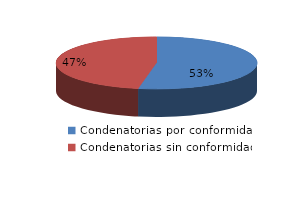
| Category | Series 0 |
|---|---|
| 0 | 923 |
| 1 | 822 |